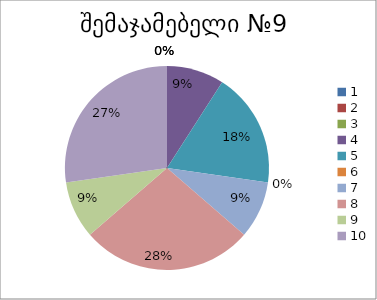
| Category | რაოდენობა | ქულა |
|---|---|---|
| 0 | 0 | 1 |
| 1 | 0 | 2 |
| 2 | 0 | 3 |
| 3 | 1 | 4 |
| 4 | 2 | 5 |
| 5 | 0 | 6 |
| 6 | 1 | 7 |
| 7 | 3 | 8 |
| 8 | 1 | 9 |
| 9 | 3 | 10 |